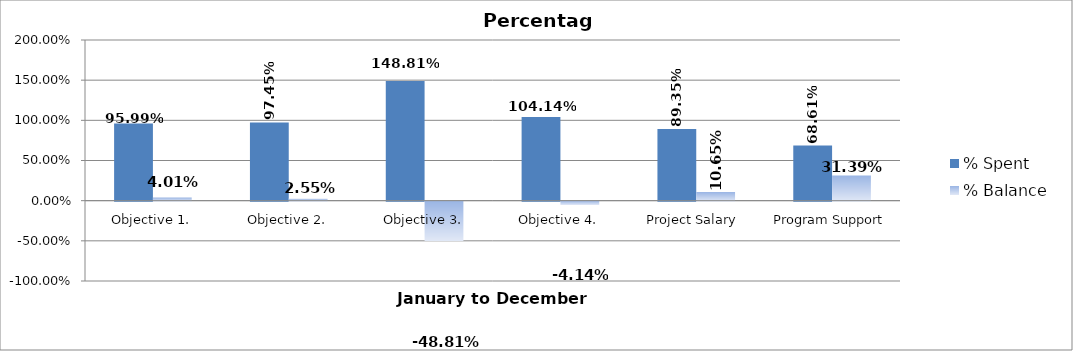
| Category | % Spent  | % Balance  |
|---|---|---|
| Objective 1. | 0.96 | 0.04 |
| Objective 2. | 0.974 | 0.026 |
| Objective 3. | 1.488 | -0.488 |
| Objective 4. | 1.041 | -0.041 |
| Project Salary  | 0.893 | 0.107 |
| Program Support | 0.686 | 0.314 |